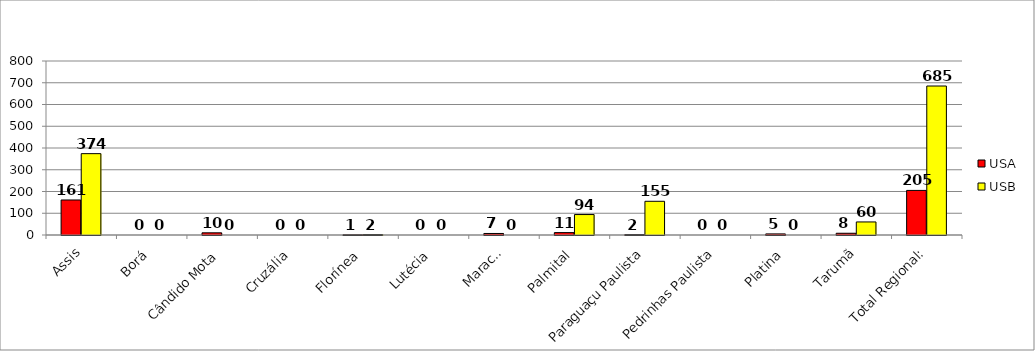
| Category | USA | USB |
|---|---|---|
| Assis | 161 | 374 |
| Borá | 0 | 0 |
| Cândido Mota | 10 | 0 |
| Cruzália | 0 | 0 |
| Florínea | 1 | 2 |
| Lutécia | 0 | 0 |
| Maracaí | 7 | 0 |
| Palmital | 11 | 94 |
| Paraguaçu Paulista | 2 | 155 |
| Pedrinhas Paulista | 0 | 0 |
| Platina | 5 | 0 |
| Tarumã | 8 | 60 |
| Total Regional: | 205 | 685 |